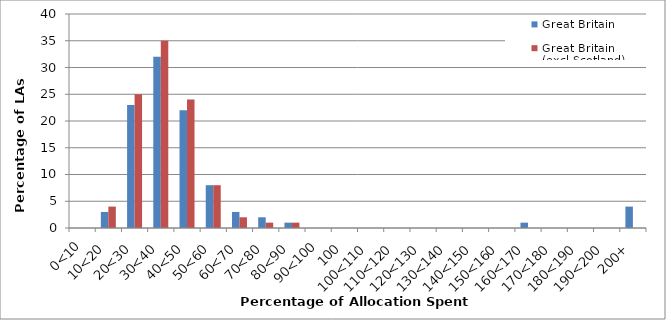
| Category | Great Britain | Great Britain (excl.Scotland) |
|---|---|---|
| 0<10 | 0 | 0 |
| 10<20 | 3 | 4 |
| 20<30 | 23 | 25 |
| 30<40 | 32 | 35 |
| 40<50 | 22 | 24 |
| 50<60 | 8 | 8 |
| 60<70 | 3 | 2 |
| 70<80 | 2 | 1 |
| 80<90 | 1 | 1 |
| 90<100 | 0 | 0 |
| 100 | 0 | 0 |
| 100<110 | 0 | 0 |
| 110<120 | 0 | 0 |
| 120<130 | 0 | 0 |
| 130<140 | 0 | 0 |
| 140<150 | 0 | 0 |
| 150<160 | 0 | 0 |
| 160<170 | 1 | 0 |
| 170<180 | 0 | 0 |
| 180<190 | 0 | 0 |
| 190<200 | 0 | 0 |
| 200+ | 4 | 0 |